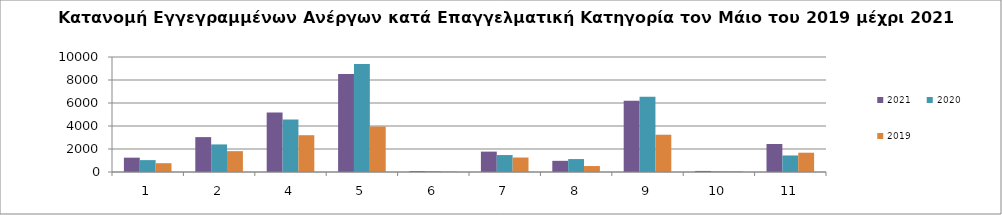
| Category | 2021 | 2020 | 2019 |
|---|---|---|---|
| 1.0 | 1246 | 1033 | 766 |
| 2.0 | 3034 | 2398 | 1813 |
| 4.0 | 5181 | 4567 | 3199 |
| 5.0 | 8520 | 9381 | 3952 |
| 6.0 | 77 | 64 | 38 |
| 7.0 | 1772 | 1474 | 1260 |
| 8.0 | 972 | 1126 | 518 |
| 9.0 | 6205 | 6537 | 3240 |
| 10.0 | 92 | 52 | 60 |
| 11.0 | 2436 | 1439 | 1677 |